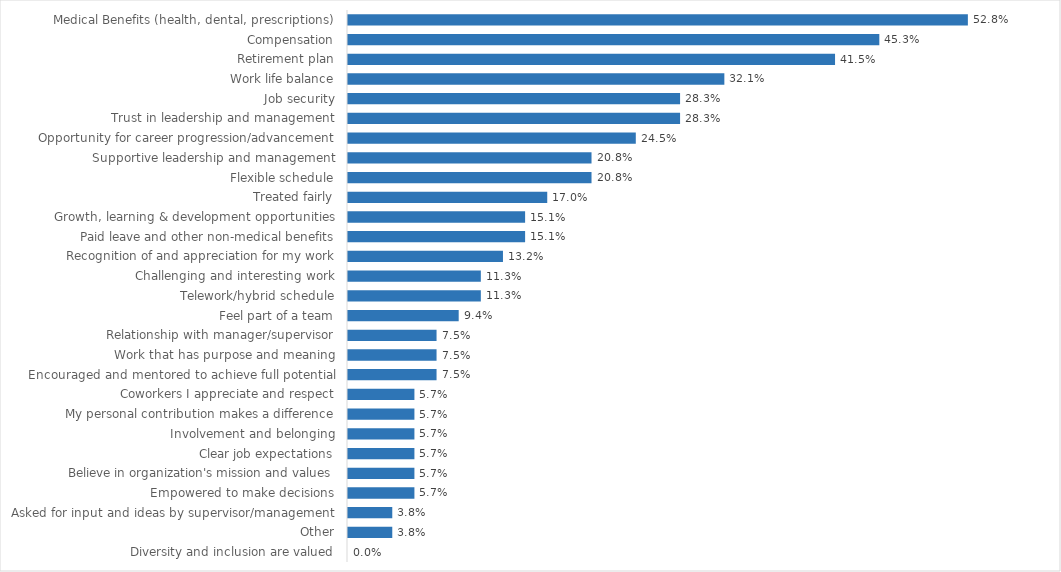
| Category | Vermont Veterans' Home |
|---|---|
| Medical Benefits (health, dental, prescriptions) | 0.528 |
| Compensation | 0.453 |
| Retirement plan | 0.415 |
| Work life balance | 0.321 |
| Job security | 0.283 |
| Trust in leadership and management | 0.283 |
| Opportunity for career progression/advancement | 0.245 |
| Supportive leadership and management | 0.208 |
| Flexible schedule | 0.208 |
| Treated fairly | 0.17 |
| Growth, learning & development opportunities | 0.151 |
| Paid leave and other non-medical benefits | 0.151 |
| Recognition of and appreciation for my work | 0.132 |
| Challenging and interesting work | 0.113 |
| Telework/hybrid schedule | 0.113 |
| Feel part of a team | 0.094 |
| Relationship with manager/supervisor | 0.075 |
| Work that has purpose and meaning | 0.075 |
| Encouraged and mentored to achieve full potential | 0.075 |
| Coworkers I appreciate and respect | 0.057 |
| My personal contribution makes a difference | 0.057 |
| Involvement and belonging | 0.057 |
| Clear job expectations | 0.057 |
| Believe in organization's mission and values | 0.057 |
| Empowered to make decisions | 0.057 |
| Asked for input and ideas by supervisor/management | 0.038 |
| Other | 0.038 |
| Diversity and inclusion are valued | 0 |